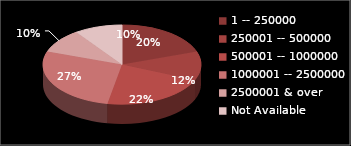
| Category | Series 0 |
|---|---|
| 1 -- 250000 | 10 |
| 250001 -- 500000 | 6 |
| 500001 -- 1000000 | 11 |
| 1000001 -- 2500000 | 14 |
| 2500001 & over | 5 |
| Not Available | 5 |